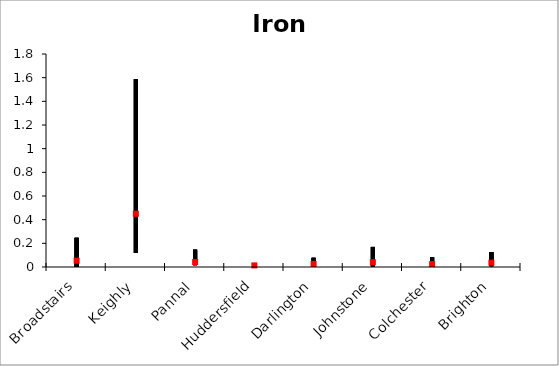
| Category | Iron | Series 4 | Series 5 | Series 1 | Series 2 |
|---|---|---|---|---|---|
| Broadstairs | 0.247 | 0.001 | 0.053 | 0.001 | 0.053 |
| Keighly | 1.586 | 0.12 | 0.45 | 0.12 | 0.45 |
| Pannal | 0.146 | 0.016 | 0.043 | 0.016 | 0.043 |
| Huddersfield | 0.019 | 0.01 | 0.014 | 0.01 | 0.014 |
| Darlington | 0.078 | 0.007 | 0.026 | 0.007 | 0.026 |
| Johnstone | 0.17 | 0.005 | 0.041 | 0.005 | 0.041 |
| Colchester | 0.082 | 0.006 | 0.024 | 0.006 | 0.024 |
| Brighton | 0.126 | 0.007 | 0.037 | 0.007 | 0.037 |